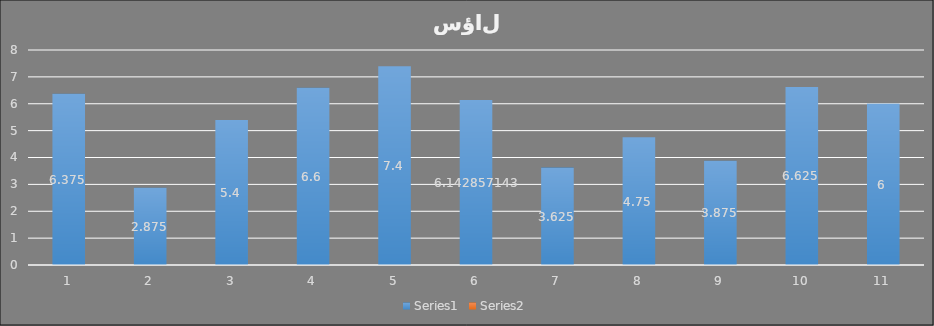
| Category | Series 0 | Series 1 |
|---|---|---|
| 0 | 6.375 | 0 |
| 1 | 2.875 | 0 |
| 2 | 5.4 | 0 |
| 3 | 6.6 | 0 |
| 4 | 7.4 | 0 |
| 5 | 6.143 | 0 |
| 6 | 3.625 | 0 |
| 7 | 4.75 | 0 |
| 8 | 3.875 | 0 |
| 9 | 6.625 | 0 |
| 10 | 6 | 0 |